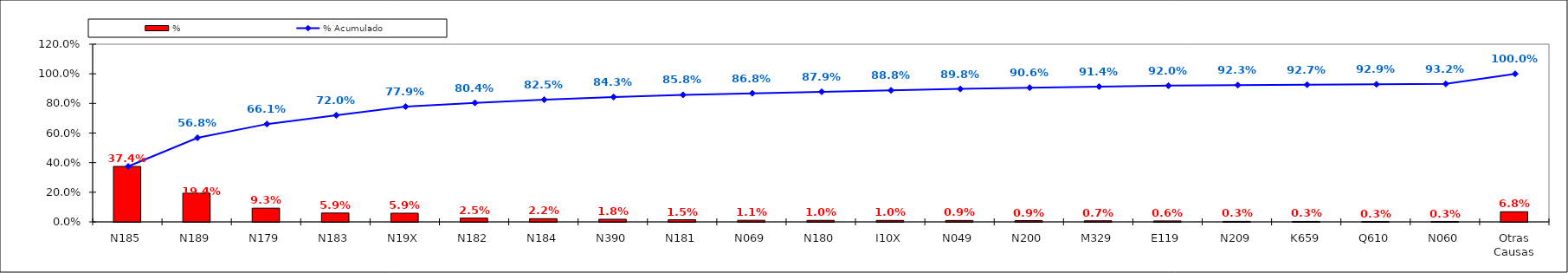
| Category | % |
|---|---|
| N185 | 0.374 |
| N189 | 0.194 |
| N179 | 0.093 |
| N183 | 0.059 |
| N19X | 0.059 |
| N182 | 0.025 |
| N184 | 0.022 |
| N390 | 0.018 |
| N181 | 0.015 |
| N069 | 0.011 |
| N180 | 0.01 |
| I10X | 0.01 |
| N049 | 0.009 |
| N200 | 0.009 |
| M329 | 0.007 |
| E119 | 0.006 |
| N209 | 0.003 |
| K659 | 0.003 |
| Q610 | 0.003 |
| N060 | 0.003 |
| Otras Causas | 0.068 |